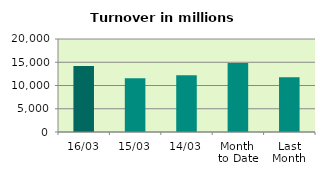
| Category | Series 0 |
|---|---|
| 16/03 | 14208.159 |
| 15/03 | 11584.011 |
| 14/03 | 12189.994 |
| Month 
to Date | 14849.929 |
| Last
Month | 11787.675 |